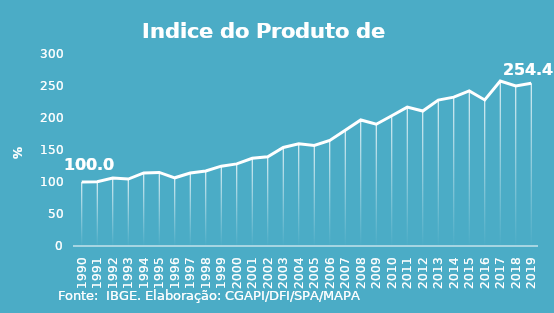
| Category | Indice de Prod. base 1990 |
|---|---|
| 1990.0 | 100 |
| 1991.0 | 100.275 |
| 1992.0 | 106.203 |
| 1993.0 | 104.57 |
| 1994.0 | 114.164 |
| 1995.0 | 115.024 |
| 1996.0 | 106.552 |
| 1997.0 | 114.037 |
| 1998.0 | 117.319 |
| 1999.0 | 124.734 |
| 2000.0 | 128.293 |
| 2001.0 | 136.975 |
| 2002.0 | 139.51 |
| 2003.0 | 153.868 |
| 2004.0 | 159.641 |
| 2005.0 | 157.136 |
| 2006.0 | 164.858 |
| 2007.0 | 180.781 |
| 2008.0 | 196.91 |
| 2009.0 | 190.309 |
| 2010.0 | 203.581 |
| 2011.0 | 217.041 |
| 2012.0 | 210.932 |
| 2013.0 | 228.009 |
| 2014.0 | 232.562 |
| 2015.0 | 242.318 |
| 2016.0 | 228.239 |
| 2017.0 | 257.766 |
| 2018.0 | 250.124 |
| 2019.0 | 254.357 |